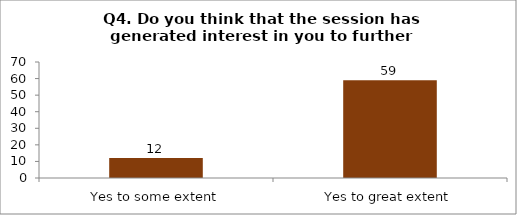
| Category | Q4. Do you think that the session has generated interest in you to further explore the topics? |
|---|---|
| Yes to some extent | 12 |
| Yes to great extent | 59 |